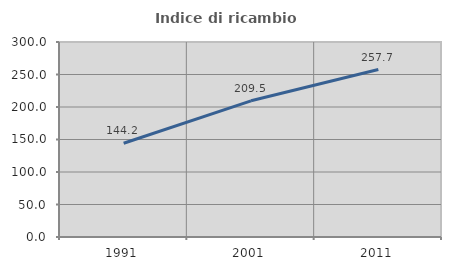
| Category | Indice di ricambio occupazionale  |
|---|---|
| 1991.0 | 144.216 |
| 2001.0 | 209.499 |
| 2011.0 | 257.655 |